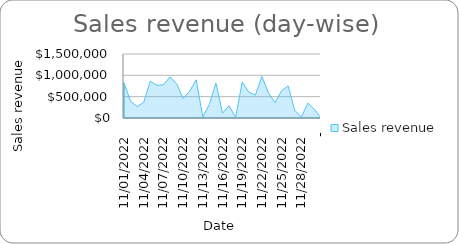
| Category | Sales revenue |
|---|---|
| 11/01/2022 | 823560.854 |
| 11/02/2022 | 391276.884 |
| 11/03/2022 | 266918.354 |
| 11/04/2022 | 366547.693 |
| 11/05/2022 | 863828.121 |
| 11/06/2022 | 765678.295 |
| 11/07/2022 | 779016.318 |
| 11/08/2022 | 963333.065 |
| 11/09/2022 | 803151.07 |
| 11/10/2022 | 457162.551 |
| 11/11/2022 | 627914.758 |
| 11/12/2022 | 894625.8 |
| 11/13/2022 | 21030.5 |
| 11/14/2022 | 320909.569 |
| 11/15/2022 | 817927.631 |
| 11/16/2022 | 114382.756 |
| 11/17/2022 | 288734.287 |
| 11/18/2022 | 11636.409 |
| 11/19/2022 | 844530.699 |
| 11/20/2022 | 606707.375 |
| 11/21/2022 | 536578.087 |
| 11/22/2022 | 973918.722 |
| 11/23/2022 | 588466.024 |
| 11/24/2022 | 361870.295 |
| 11/25/2022 | 636335.808 |
| 11/26/2022 | 754076.895 |
| 11/27/2022 | 179703.681 |
| 11/28/2022 | 21810.331 |
| 11/29/2022 | 348713.32 |
| 11/30/2022 | 204702.146 |
| - | 0 |